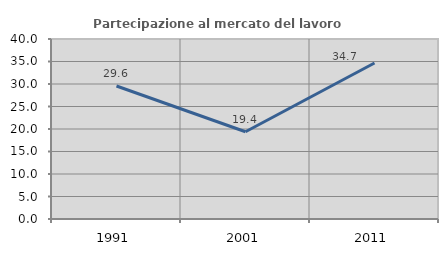
| Category | Partecipazione al mercato del lavoro  femminile |
|---|---|
| 1991.0 | 29.555 |
| 2001.0 | 19.388 |
| 2011.0 | 34.667 |